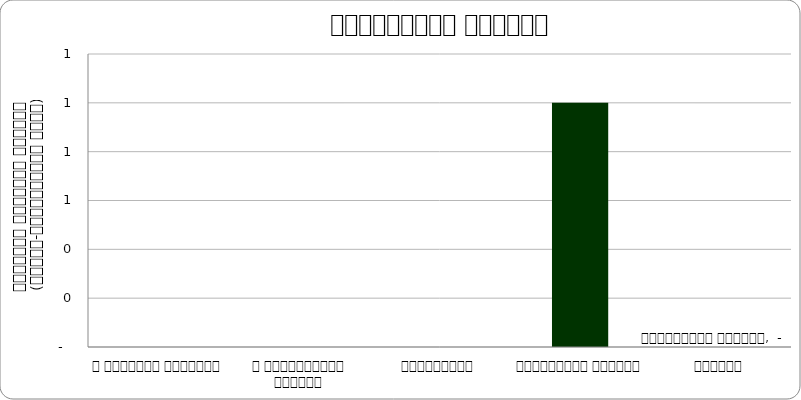
| Category | प्राकृतिक प्रकोप |
|---|---|
| द हिमालयन टाइम्स् | 0 |
| द काठमाण्डौं पोस्ट् | 0 |
| कान्तिपुर | 0 |
| अन्नपूर्ण पोस्ट् | 1 |
| नागरिक | 0 |